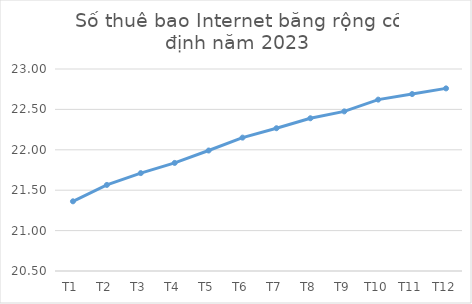
| Category | Series 0 |
|---|---|
| T1 | 21.362 |
| T2 | 21.565 |
| T3 | 21.711 |
| T4 | 21.838 |
| T5 | 21.991 |
| T6 | 22.151 |
| T7 | 22.267 |
| T8 | 22.39 |
| T9 | 22.475 |
| T10 | 22.621 |
| T11 | 22.69 |
| T12 | 22.76 |